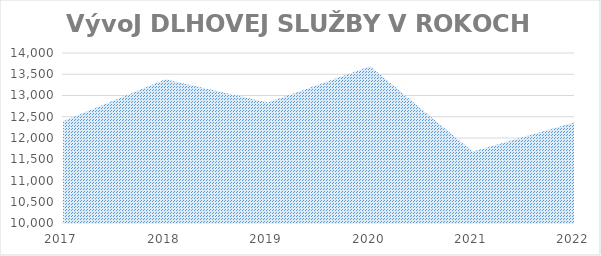
| Category | Series 0 |
|---|---|
| 2017.0 | 12394 |
| 2018.0 | 13381 |
| 2019.0 | 12837 |
| 2020.0 | 13686 |
| 2021.0 | 11680 |
| 2022.0 | 12374 |